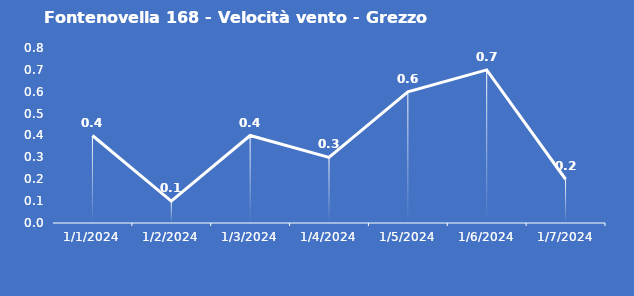
| Category | Fontenovella 168 - Velocità vento - Grezzo (m/s) |
|---|---|
| 1/1/24 | 0.4 |
| 1/2/24 | 0.1 |
| 1/3/24 | 0.4 |
| 1/4/24 | 0.3 |
| 1/5/24 | 0.6 |
| 1/6/24 | 0.7 |
| 1/7/24 | 0.2 |